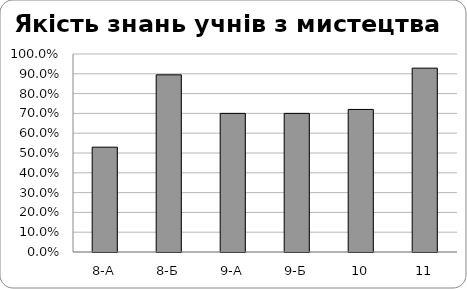
| Category | Series 0 |
|---|---|
| 8-А | 0.529 |
| 8-Б | 0.895 |
| 9-А | 0.7 |
| 9-Б | 0.7 |
| 10 | 0.72 |
| 11 | 0.929 |